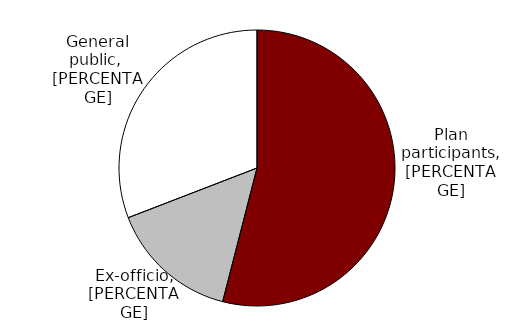
| Category | 54.0% |
|---|---|
| Plan participants | 0.54 |
| Ex-officio | 0.151 |
| General public | 0.309 |